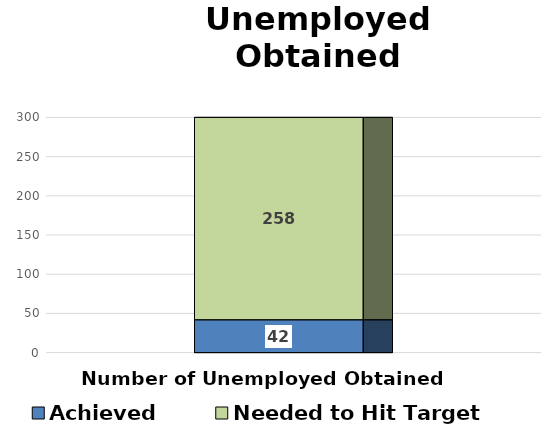
| Category | Achieved | Needed to Hit Target |
|---|---|---|
| Number of Unemployed Obtained Employment | 42 | 258 |